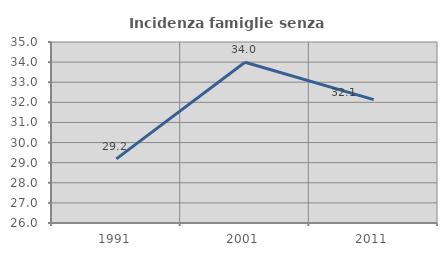
| Category | Incidenza famiglie senza nuclei |
|---|---|
| 1991.0 | 29.187 |
| 2001.0 | 33.996 |
| 2011.0 | 32.135 |